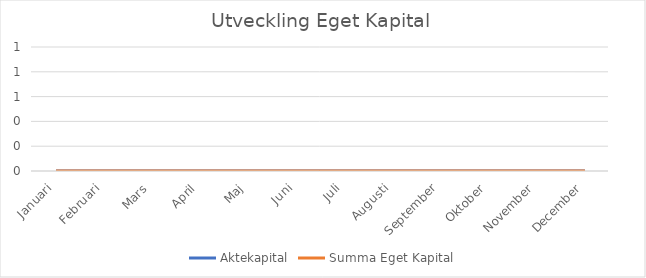
| Category | Aktekapital | Summa Eget Kapital |
|---|---|---|
| Januari | 0 | 0 |
| Februari | 0 | 0 |
| Mars | 0 | 0 |
| April | 0 | 0 |
| Maj | 0 | 0 |
| Juni | 0 | 0 |
| Juli | 0 | 0 |
| Augusti | 0 | 0 |
| September | 0 | 0 |
| Oktober | 0 | 0 |
| November | 0 | 0 |
| December | 0 | 0 |